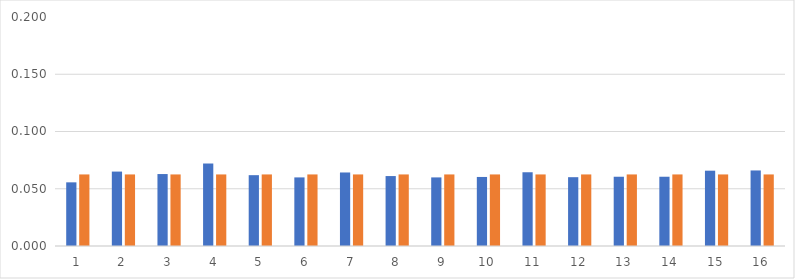
| Category | rel freq | prob |
|---|---|---|
| 0 | 0.056 | 0.062 |
| 1 | 0.065 | 0.062 |
| 2 | 0.063 | 0.062 |
| 3 | 0.072 | 0.062 |
| 4 | 0.062 | 0.062 |
| 5 | 0.06 | 0.062 |
| 6 | 0.064 | 0.062 |
| 7 | 0.061 | 0.062 |
| 8 | 0.06 | 0.062 |
| 9 | 0.06 | 0.062 |
| 10 | 0.064 | 0.062 |
| 11 | 0.06 | 0.062 |
| 12 | 0.06 | 0.062 |
| 13 | 0.06 | 0.062 |
| 14 | 0.066 | 0.062 |
| 15 | 0.066 | 0.062 |